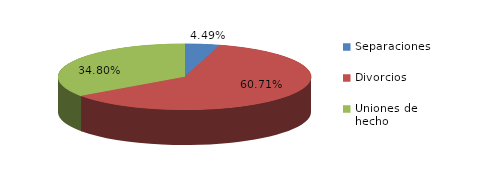
| Category | Series 0 |
|---|---|
| Separaciones | 57 |
| Divorcios | 771 |
| Uniones de hecho | 442 |